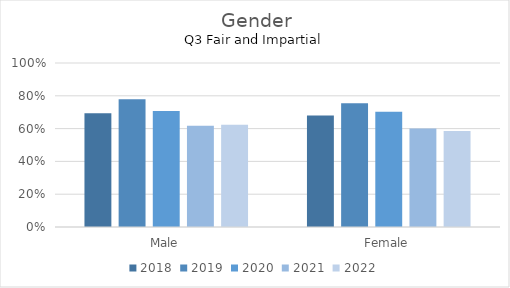
| Category | 2018 | 2019 | 2020 | 2021 | 2022 |
|---|---|---|---|---|---|
| Male | 0.694 | 0.779 | 0.708 | 0.617 | 0.623 |
| Female | 0.68 | 0.755 | 0.702 | 0.601 | 0.585 |